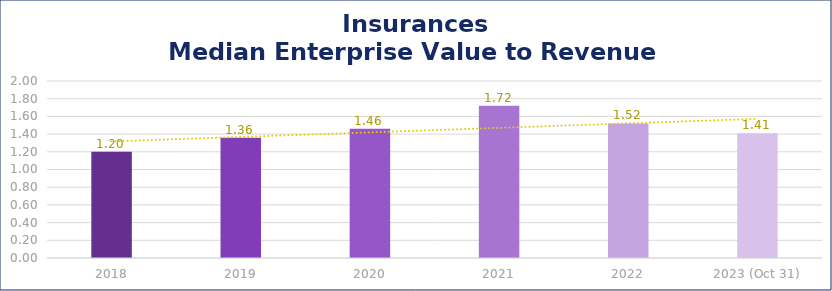
| Category | Insurances |
|---|---|
| 2018 | 1.2 |
| 2019 | 1.36 |
| 2020 | 1.46 |
| 2021 | 1.72 |
| 2022 | 1.52 |
| 2023 (Oct 31) | 1.41 |